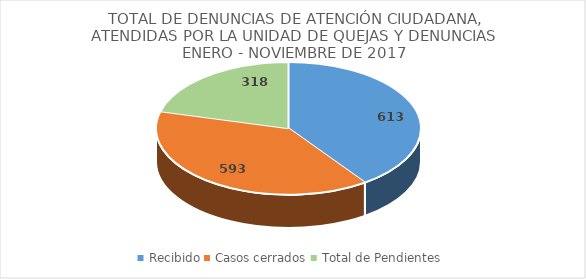
| Category | Series 0 |
|---|---|
| Recibido | 613 |
| Casos cerrados | 593 |
| Total de Pendientes | 318 |